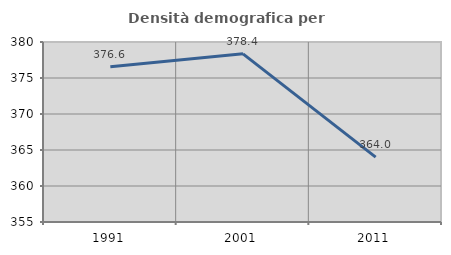
| Category | Densità demografica |
|---|---|
| 1991.0 | 376.562 |
| 2001.0 | 378.355 |
| 2011.0 | 364.01 |